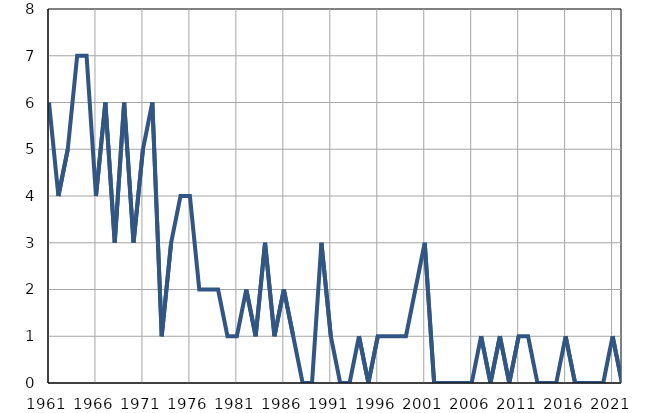
| Category | Умрла 
одојчад |
|---|---|
| 1961.0 | 6 |
| 1962.0 | 4 |
| 1963.0 | 5 |
| 1964.0 | 7 |
| 1965.0 | 7 |
| 1966.0 | 4 |
| 1967.0 | 6 |
| 1968.0 | 3 |
| 1969.0 | 6 |
| 1970.0 | 3 |
| 1971.0 | 5 |
| 1972.0 | 6 |
| 1973.0 | 1 |
| 1974.0 | 3 |
| 1975.0 | 4 |
| 1976.0 | 4 |
| 1977.0 | 2 |
| 1978.0 | 2 |
| 1979.0 | 2 |
| 1980.0 | 1 |
| 1981.0 | 1 |
| 1982.0 | 2 |
| 1983.0 | 1 |
| 1984.0 | 3 |
| 1985.0 | 1 |
| 1986.0 | 2 |
| 1987.0 | 1 |
| 1988.0 | 0 |
| 1989.0 | 0 |
| 1990.0 | 3 |
| 1991.0 | 1 |
| 1992.0 | 0 |
| 1993.0 | 0 |
| 1994.0 | 1 |
| 1995.0 | 0 |
| 1996.0 | 1 |
| 1997.0 | 1 |
| 1998.0 | 1 |
| 1999.0 | 1 |
| 2000.0 | 2 |
| 2001.0 | 3 |
| 2002.0 | 0 |
| 2003.0 | 0 |
| 2004.0 | 0 |
| 2005.0 | 0 |
| 2006.0 | 0 |
| 2007.0 | 1 |
| 2008.0 | 0 |
| 2009.0 | 1 |
| 2010.0 | 0 |
| 2011.0 | 1 |
| 2012.0 | 1 |
| 2013.0 | 0 |
| 2014.0 | 0 |
| 2015.0 | 0 |
| 2016.0 | 1 |
| 2017.0 | 0 |
| 2018.0 | 0 |
| 2019.0 | 0 |
| 2020.0 | 0 |
| 2021.0 | 1 |
| 2022.0 | 0 |